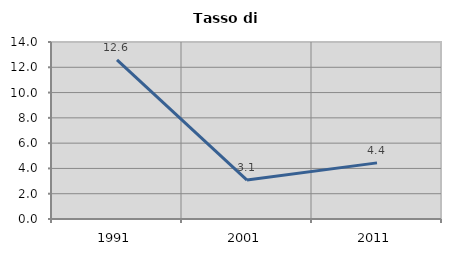
| Category | Tasso di disoccupazione   |
|---|---|
| 1991.0 | 12.591 |
| 2001.0 | 3.081 |
| 2011.0 | 4.44 |